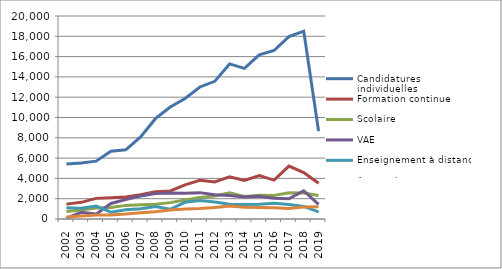
| Category | Candidatures individuelles | Formation continue | Scolaire | VAE | Enseignement à distance | Apprentissage |
|---|---|---|---|---|---|---|
| 2002 | 5415 | 1465 | 735 | 76 | 1106 | 198 |
| 2003 | 5525 | 1642 | 880 | 654 | 1049 | 284 |
| 2004 | 5700 | 2032 | 1086 | 483 | 1267 | 388 |
| 2005 | 6674 | 2087 | 1125 | 1530 | 670 | 388 |
| 2006 | 6820 | 2166 | 1341 | 1925 | 920 | 484 |
| 2007 | 8079 | 2391 | 1412 | 2259 | 1008 | 620 |
| 2008 | 9883 | 2676 | 1446 | 2501 | 1223 | 726 |
| 2009 | 11028 | 2760 | 1612 | 2570 | 961 | 884 |
| 2010 | 11868 | 3359 | 1880 | 2543 | 1645 | 993 |
| 2011 | 13010 | 3817 | 2119 | 2598 | 1821 | 1041 |
| 2012 | 13561 | 3653 | 2269 | 2399 | 1681 | 1135 |
| 2013 | 15279 | 4154 | 2571 | 2313 | 1463 | 1291 |
| 2014 | 14845 | 3803 | 2229 | 2168 | 1436 | 1159 |
| 2015 | 16171 | 4271 | 2349 | 2251 | 1455 | 1143 |
| 2016 | 16601 | 3834 | 2316 | 2043 | 1542 | 1115 |
| 2017 | 17970 | 5214 | 2591 | 1988 | 1419 | 1036 |
| 2018 | 18503 | 4570 | 2570 | 2782 | 1244 | 1186 |
| 2019 | 8656 | 3514 | 2318 | 1448 | 704 | 1213 |